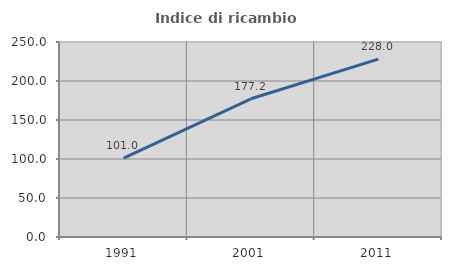
| Category | Indice di ricambio occupazionale  |
|---|---|
| 1991.0 | 101.02 |
| 2001.0 | 177.206 |
| 2011.0 | 227.962 |